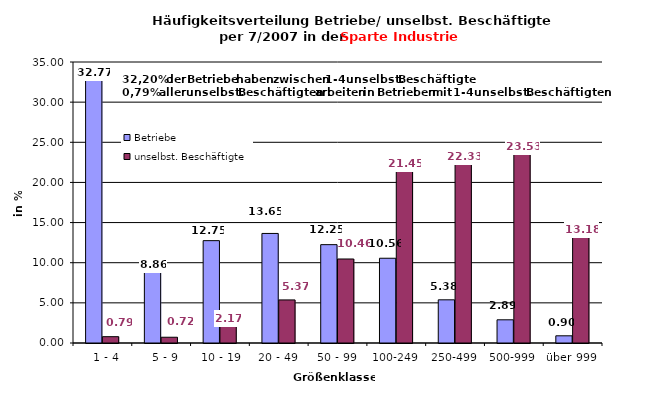
| Category | Betriebe | unselbst. Beschäftigte |
|---|---|---|
|   1 - 4 | 32.769 | 0.787 |
|   5 - 9 | 8.865 | 0.717 |
|  10 - 19 | 12.749 | 2.17 |
| 20 - 49 | 13.645 | 5.365 |
| 50 - 99 | 12.251 | 10.465 |
| 100-249 | 10.558 | 21.448 |
| 250-499 | 5.378 | 22.331 |
| 500-999 | 2.888 | 23.533 |
| über 999 | 0.896 | 13.183 |